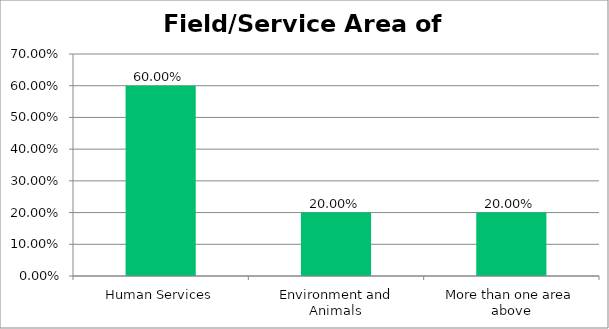
| Category | Responses |
|---|---|
| Human Services | 0.6 |
| Environment and Animals | 0.2 |
| More than one area above | 0.2 |